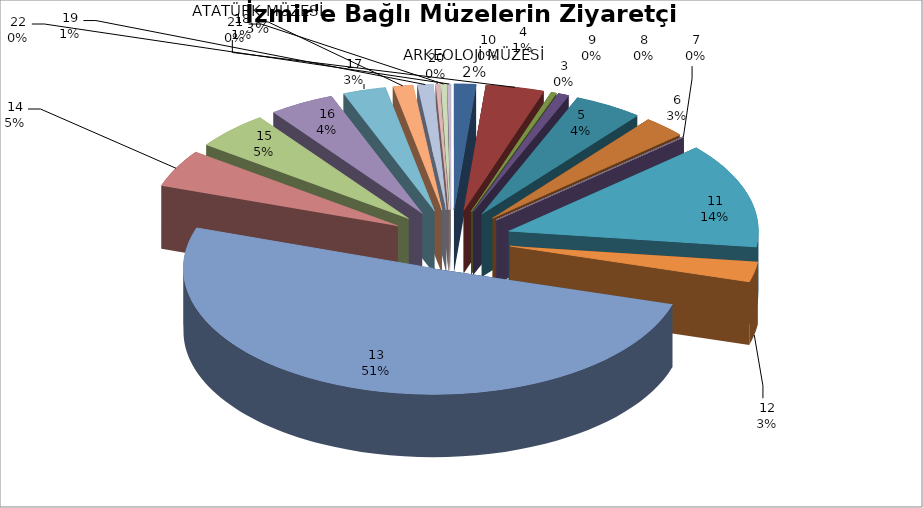
| Category | Series 0 |
|---|---|
| 0 | 49584 |
| 1 | 132382 |
| 2 | 12267 |
| 3 | 24840 |
| 4 | 155785 |
| 5 | 97243 |
| 6 | 1102 |
| 7 | 0 |
| 8 | 0 |
| 9 | 0 |
| 10 | 473203 |
| 11 | 90416 |
| 12 | 1773052 |
| 13 | 167200 |
| 14 | 170623 |
| 15 | 148301 |
| 16 | 97347 |
| 17 | 45366 |
| 18 | 35841 |
| 19 | 8931 |
| 20 | 12357 |
| 21 | 7726 |